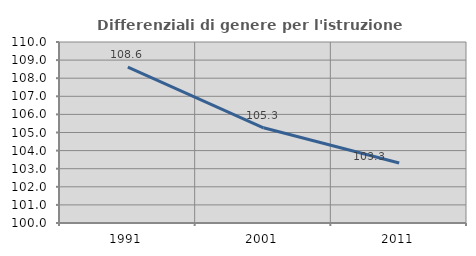
| Category | Differenziali di genere per l'istruzione superiore |
|---|---|
| 1991.0 | 108.607 |
| 2001.0 | 105.26 |
| 2011.0 | 103.314 |